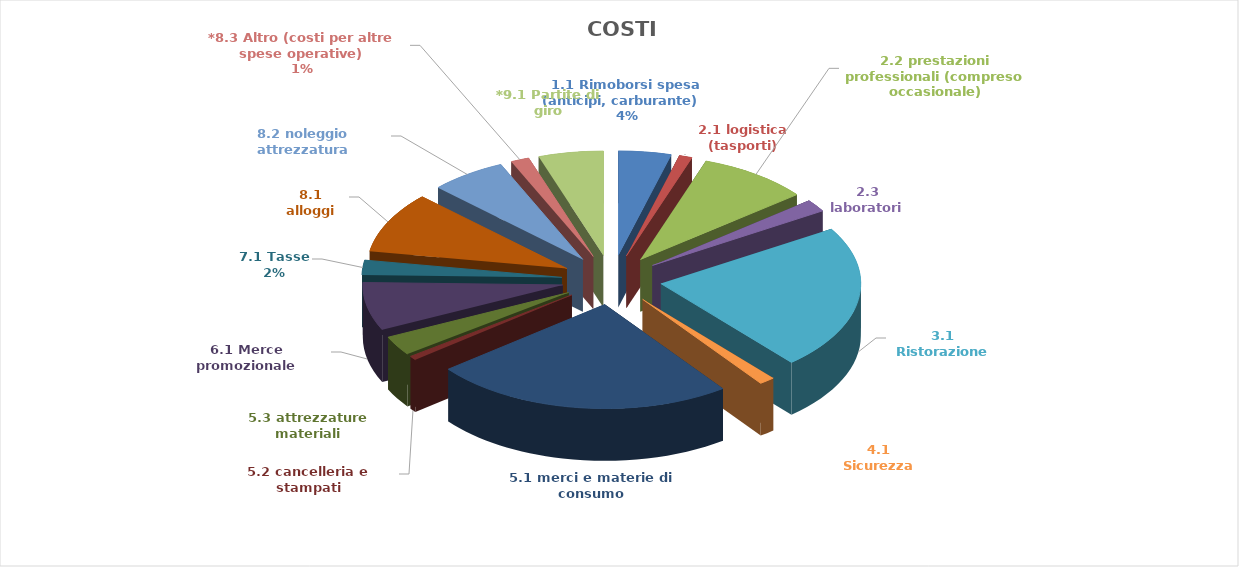
| Category | COSTI |
|---|---|
| 1.1 Rimoborsi spesa (anticipi, carburante)   | 3349.6 |
| 2.1 logistica (tasporti) | 825 |
| 2.2 prestazioni professionali (compreso occasionale) | 7060.8 |
| 2.3 laboratori | 1500 |
| 3.1 Ristorazione | 17658.8 |
| 4.1 Sicurezza | 1000 |
| 5.1 merci e materie di consumo | 19150.69 |
| 5.2 cancelleria e stampati | 488.24 |
| 5.3 attrezzature materiali | 2359.31 |
| 6.1 Merce promozionale | 5843.25 |
| 7.1 Tasse  | 1793.64 |
| 8.1 alloggi | 7437.2 |
| 8.2 noleggio attrezzatura | 4846 |
| *8.3 Altro (costi per altre spese operative) | 1160.77 |
| *9.1 Partite di giro | 4118.52 |